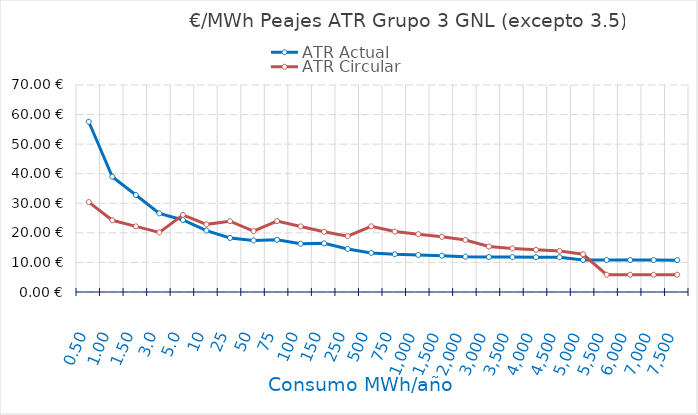
| Category | ATR Actual | ATR Circular |
|---|---|---|
| 0.5 | 57.564 | 30.403 |
| 1.0 | 38.984 | 24.247 |
| 1.5 | 32.791 | 22.195 |
| 3.0 | 26.597 | 20.143 |
| 5.0 | 24.346 | 26.091 |
| 10.0 | 20.763 | 22.881 |
| 25.0 | 18.281 | 23.945 |
| 50.0 | 17.427 | 20.6 |
| 75.0 | 17.644 | 23.979 |
| 100.0 | 16.308 | 22.164 |
| 150.0 | 16.443 | 20.348 |
| 250.0 | 14.572 | 18.896 |
| 500.0 | 13.226 | 22.205 |
| 750.0 | 12.758 | 20.429 |
| 1000.0 | 12.524 | 19.542 |
| 1500.0 | 12.29 | 18.654 |
| 2000.0 | 11.948 | 17.596 |
| 3000.0 | 11.831 | 15.374 |
| 3500.0 | 11.798 | 14.739 |
| 4000.0 | 11.773 | 14.263 |
| 4500.0 | 11.754 | 13.893 |
| 5000.0 | 10.82 | 12.762 |
| 5500.0 | 10.807 | 5.839 |
| 6000.0 | 10.797 | 5.839 |
| 7000.0 | 10.78 | 5.839 |
| 7500.0 | 10.773 | 5.839 |